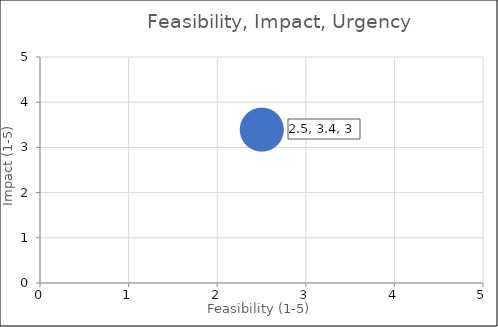
| Category | Series 0 |
|---|---|
| 2.5 | 3.4 |
| 0.0 | 0 |
| 0.0 | 0 |
| 15.0 | 15 |